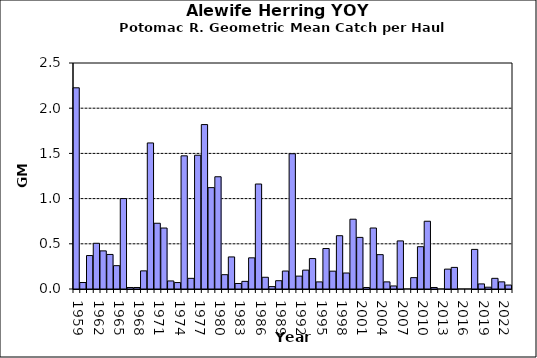
| Category | Series 0 |
|---|---|
| 1959.0 | 2.226 |
| 1960.0 | 0.072 |
| 1961.0 | 0.37 |
| 1962.0 | 0.506 |
| 1963.0 | 0.422 |
| 1964.0 | 0.382 |
| 1965.0 | 0.258 |
| 1966.0 | 1 |
| 1967.0 | 0.017 |
| 1968.0 | 0.017 |
| 1969.0 | 0.201 |
| 1970.0 | 1.616 |
| 1971.0 | 0.727 |
| 1972.0 | 0.674 |
| 1973.0 | 0.089 |
| 1974.0 | 0.071 |
| 1975.0 | 1.473 |
| 1976.0 | 0.118 |
| 1977.0 | 1.48 |
| 1978.0 | 1.819 |
| 1979.0 | 1.121 |
| 1980.0 | 1.242 |
| 1981.0 | 0.158 |
| 1982.0 | 0.355 |
| 1983.0 | 0.061 |
| 1984.0 | 0.084 |
| 1985.0 | 0.345 |
| 1986.0 | 1.161 |
| 1987.0 | 0.13 |
| 1988.0 | 0.027 |
| 1989.0 | 0.092 |
| 1990.0 | 0.199 |
| 1991.0 | 1.496 |
| 1992.0 | 0.143 |
| 1993.0 | 0.209 |
| 1994.0 | 0.337 |
| 1995.0 | 0.079 |
| 1996.0 | 0.448 |
| 1997.0 | 0.197 |
| 1998.0 | 0.589 |
| 1999.0 | 0.177 |
| 2000.0 | 0.772 |
| 2001.0 | 0.571 |
| 2002.0 | 0.017 |
| 2003.0 | 0.675 |
| 2004.0 | 0.38 |
| 2005.0 | 0.079 |
| 2006.0 | 0.034 |
| 2007.0 | 0.532 |
| 2008.0 | 0 |
| 2009.0 | 0.126 |
| 2010.0 | 0.468 |
| 2011.0 | 0.749 |
| 2012.0 | 0.017 |
| 2013.0 | 0 |
| 2014.0 | 0.22 |
| 2015.0 | 0.239 |
| 2016.0 | 0 |
| 2017.0 | 0 |
| 2018.0 | 0.438 |
| 2019.0 | 0.056 |
| 2020.0 | 0.02 |
| 2021.0 | 0.118 |
| 2022.0 | 0.079 |
| 2023.0 | 0.044 |